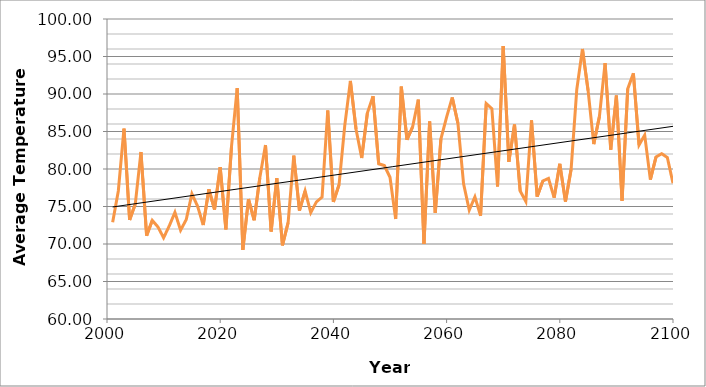
| Category | A2 |
|---|---|
| 2001.0 | 72.914 |
| 2002.0 | 77.068 |
| 2003.0 | 85.374 |
| 2004.0 | 73.198 |
| 2005.0 | 75.346 |
| 2006.0 | 82.263 |
| 2007.0 | 71.103 |
| 2008.0 | 73.152 |
| 2009.0 | 72.277 |
| 2010.0 | 70.83 |
| 2011.0 | 72.412 |
| 2012.0 | 74.221 |
| 2013.0 | 71.836 |
| 2014.0 | 73.258 |
| 2015.0 | 76.689 |
| 2016.0 | 75.051 |
| 2017.0 | 72.522 |
| 2018.0 | 77.29 |
| 2019.0 | 74.593 |
| 2020.0 | 80.244 |
| 2021.0 | 71.951 |
| 2022.0 | 83.021 |
| 2023.0 | 90.784 |
| 2024.0 | 69.213 |
| 2025.0 | 75.992 |
| 2026.0 | 73.168 |
| 2027.0 | 78.841 |
| 2028.0 | 83.19 |
| 2029.0 | 71.665 |
| 2030.0 | 78.769 |
| 2031.0 | 69.814 |
| 2032.0 | 72.855 |
| 2033.0 | 81.774 |
| 2034.0 | 74.455 |
| 2035.0 | 77.068 |
| 2036.0 | 74.187 |
| 2037.0 | 75.61 |
| 2038.0 | 76.266 |
| 2039.0 | 87.8 |
| 2040.0 | 75.605 |
| 2041.0 | 77.896 |
| 2042.0 | 85.75 |
| 2043.0 | 91.74 |
| 2044.0 | 85.298 |
| 2045.0 | 81.464 |
| 2046.0 | 87.449 |
| 2047.0 | 89.706 |
| 2048.0 | 80.701 |
| 2049.0 | 80.467 |
| 2050.0 | 78.895 |
| 2051.0 | 73.333 |
| 2052.0 | 90.979 |
| 2053.0 | 83.899 |
| 2054.0 | 85.624 |
| 2055.0 | 89.256 |
| 2056.0 | 70.003 |
| 2057.0 | 86.337 |
| 2058.0 | 74.143 |
| 2059.0 | 84.033 |
| 2060.0 | 86.922 |
| 2061.0 | 89.541 |
| 2062.0 | 86.09 |
| 2063.0 | 78.021 |
| 2064.0 | 74.512 |
| 2065.0 | 76.285 |
| 2066.0 | 73.773 |
| 2067.0 | 88.734 |
| 2068.0 | 88.048 |
| 2069.0 | 77.673 |
| 2070.0 | 96.393 |
| 2071.0 | 80.951 |
| 2072.0 | 85.921 |
| 2073.0 | 77.059 |
| 2074.0 | 75.673 |
| 2075.0 | 86.49 |
| 2076.0 | 76.316 |
| 2077.0 | 78.399 |
| 2078.0 | 78.744 |
| 2079.0 | 76.174 |
| 2080.0 | 80.686 |
| 2081.0 | 75.654 |
| 2082.0 | 79.97 |
| 2083.0 | 90.608 |
| 2084.0 | 96.008 |
| 2085.0 | 90.444 |
| 2086.0 | 83.32 |
| 2087.0 | 87.01 |
| 2088.0 | 94.125 |
| 2089.0 | 82.591 |
| 2090.0 | 89.794 |
| 2091.0 | 75.767 |
| 2092.0 | 90.682 |
| 2093.0 | 92.759 |
| 2094.0 | 83.187 |
| 2095.0 | 84.52 |
| 2096.0 | 78.579 |
| 2097.0 | 81.606 |
| 2098.0 | 82.042 |
| 2099.0 | 81.532 |
| 2100.0 | 78.105 |